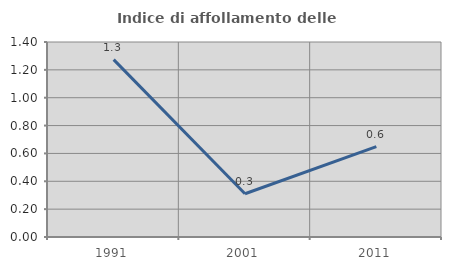
| Category | Indice di affollamento delle abitazioni  |
|---|---|
| 1991.0 | 1.274 |
| 2001.0 | 0.311 |
| 2011.0 | 0.649 |